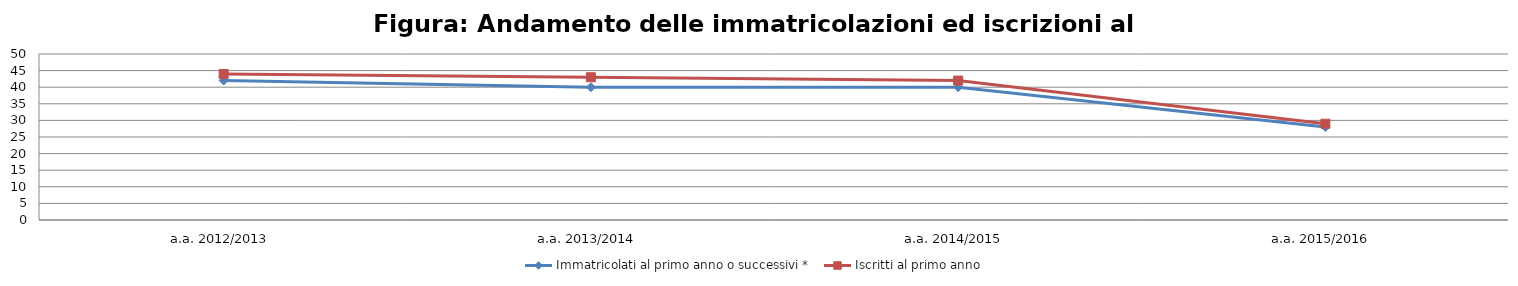
| Category | Immatricolati al primo anno o successivi * | Iscritti al primo anno  |
|---|---|---|
| a.a. 2012/2013 | 42 | 44 |
| a.a. 2013/2014 | 40 | 43 |
| a.a. 2014/2015 | 40 | 42 |
| a.a. 2015/2016 | 28 | 29 |